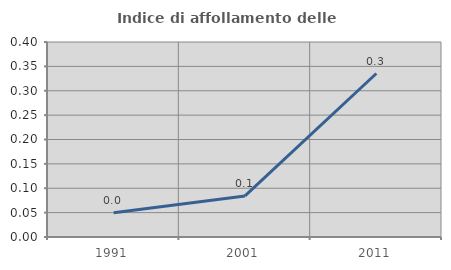
| Category | Indice di affollamento delle abitazioni  |
|---|---|
| 1991.0 | 0.05 |
| 2001.0 | 0.084 |
| 2011.0 | 0.335 |